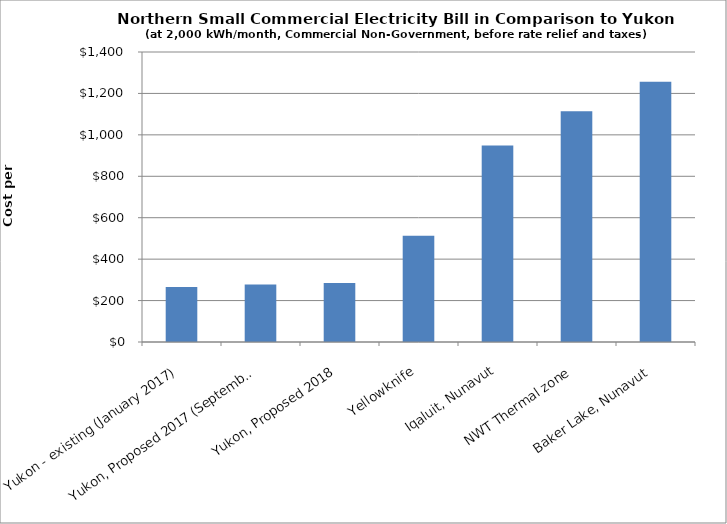
| Category | Monthly Bills before rate relief and taxes |
|---|---|
| Yukon - existing (January 2017) | 265.772 |
| Yukon, Proposed 2017 (September) | 277.821 |
| Yukon, Proposed 2018 | 284.231 |
| Yellowknife | 512.338 |
| Iqaluit, Nunavut | 948.4 |
| NWT Thermal zone | 1114.4 |
| Baker Lake, Nunavut | 1256.6 |